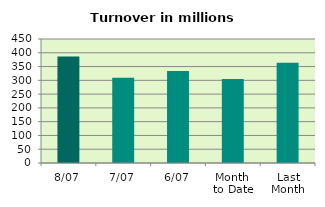
| Category | Series 0 |
|---|---|
| 8/07 | 386.506 |
| 7/07 | 309.004 |
| 6/07 | 334.176 |
| Month 
to Date | 305.125 |
| Last
Month | 364.182 |